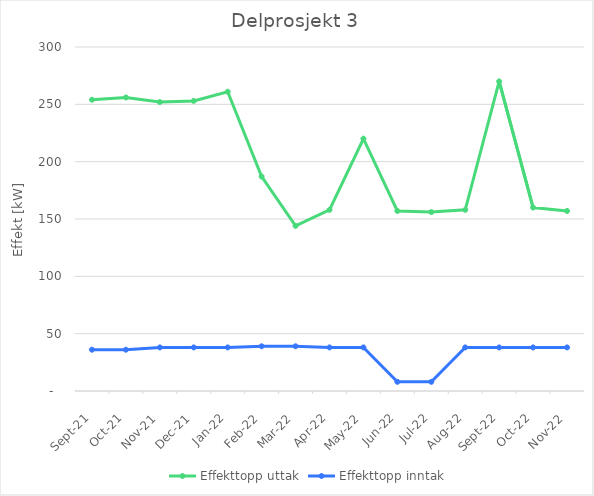
| Category | Effekttopp uttak | Effekttopp inntak |
|---|---|---|
| 2021-09-01 | 254 | 36 |
| 2021-10-01 | 256 | 36 |
| 2021-11-01 | 252 | 38 |
| 2021-12-01 | 253 | 38 |
| 2022-01-01 | 261 | 38 |
| 2022-02-01 | 187 | 39 |
| 2022-03-01 | 144 | 39 |
| 2022-04-01 | 158 | 38 |
| 2022-05-01 | 220 | 38 |
| 2022-06-01 | 157 | 8 |
| 2022-07-01 | 156 | 8 |
| 2022-08-01 | 158 | 38 |
| 2022-09-01 | 270 | 38 |
| 2022-10-01 | 160 | 38 |
| 2022-11-01 | 157 | 38 |